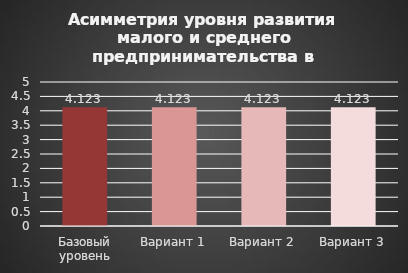
| Category | Асимметрия уровня развития малого и среднего предпринимательства |
|---|---|
| Базовый уровень | 4.123 |
| Вариант 1 | 4.123 |
| Вариант 2 | 4.123 |
| Вариант 3 | 4.123 |